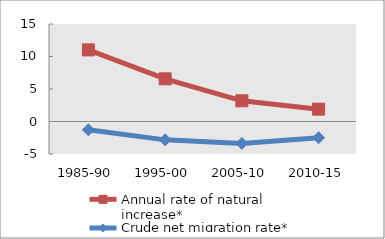
| Category | Annual rate of natural increase* | Crude net migration rate* |
|---|---|---|
| 1985-90 | 11.021 | -1.285 |
| 1995-00 | 6.565 | -2.824 |
| 2005-10 | 3.186 | -3.369 |
| 2010-15 | 1.9 | -2.486 |